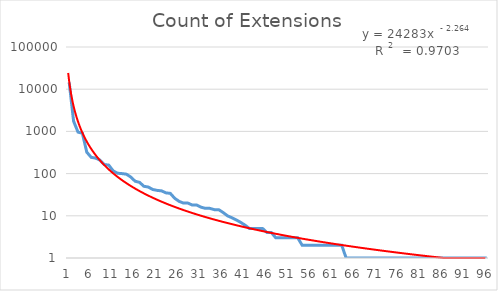
| Category | Count of Extensions |
|---|---|
| 0 | 14504 |
| 1 | 1745 |
| 2 | 964 |
| 3 | 901 |
| 4 | 322 |
| 5 | 243 |
| 6 | 233 |
| 7 | 209 |
| 8 | 164 |
| 9 | 159 |
| 10 | 116 |
| 11 | 102 |
| 12 | 100 |
| 13 | 97 |
| 14 | 83 |
| 15 | 66 |
| 16 | 62 |
| 17 | 50 |
| 18 | 48 |
| 19 | 42 |
| 20 | 40 |
| 21 | 39 |
| 22 | 35 |
| 23 | 34 |
| 24 | 26 |
| 25 | 22 |
| 26 | 20 |
| 27 | 20 |
| 28 | 18 |
| 29 | 18 |
| 30 | 16 |
| 31 | 15 |
| 32 | 15 |
| 33 | 14 |
| 34 | 14 |
| 35 | 12 |
| 36 | 10 |
| 37 | 9 |
| 38 | 8 |
| 39 | 7 |
| 40 | 6 |
| 41 | 5 |
| 42 | 5 |
| 43 | 5 |
| 44 | 5 |
| 45 | 4 |
| 46 | 4 |
| 47 | 3 |
| 48 | 3 |
| 49 | 3 |
| 50 | 3 |
| 51 | 3 |
| 52 | 3 |
| 53 | 2 |
| 54 | 2 |
| 55 | 2 |
| 56 | 2 |
| 57 | 2 |
| 58 | 2 |
| 59 | 2 |
| 60 | 2 |
| 61 | 2 |
| 62 | 2 |
| 63 | 1 |
| 64 | 1 |
| 65 | 1 |
| 66 | 1 |
| 67 | 1 |
| 68 | 1 |
| 69 | 1 |
| 70 | 1 |
| 71 | 1 |
| 72 | 1 |
| 73 | 1 |
| 74 | 1 |
| 75 | 1 |
| 76 | 1 |
| 77 | 1 |
| 78 | 1 |
| 79 | 1 |
| 80 | 1 |
| 81 | 1 |
| 82 | 1 |
| 83 | 1 |
| 84 | 1 |
| 85 | 1 |
| 86 | 1 |
| 87 | 1 |
| 88 | 1 |
| 89 | 1 |
| 90 | 1 |
| 91 | 1 |
| 92 | 1 |
| 93 | 1 |
| 94 | 1 |
| 95 | 1 |